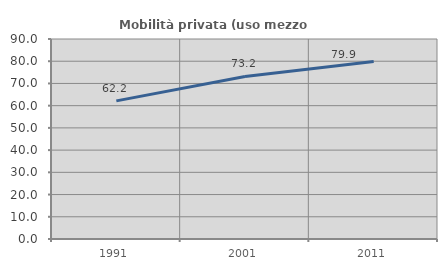
| Category | Mobilità privata (uso mezzo privato) |
|---|---|
| 1991.0 | 62.158 |
| 2001.0 | 73.154 |
| 2011.0 | 79.866 |